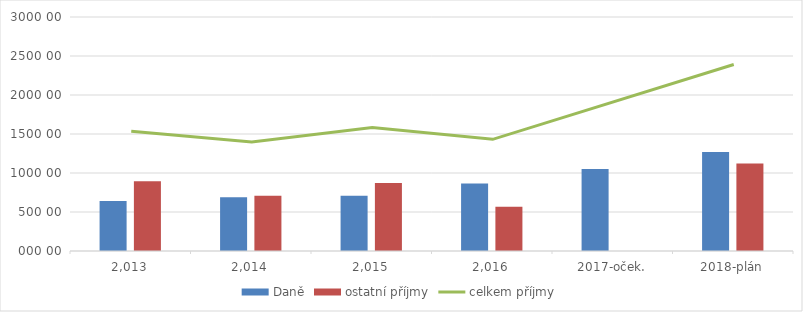
| Category | Daně | ostatní příjmy |
|---|---|---|
| 2013 | 64168.276 | 89472.981 |
| 2014 | 68876.667 | 70930.301 |
| 2015 | 70886.189 | 87313.297 |
| 2016 | 86513 | 56664.074 |
| 2017-oček. | 105237.846 | 0 |
| 2018-plán | 126998 | 112109.201 |